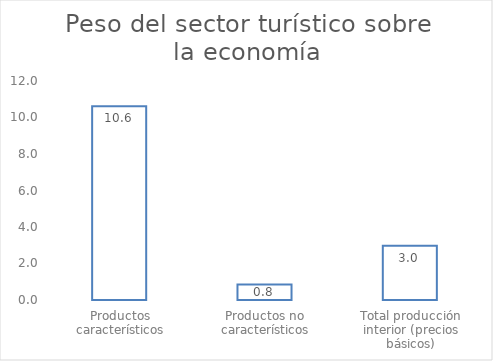
| Category | Series 0 |
|---|---|
| Productos característicos | 10.62 |
| Productos no característicos | 0.848 |
| Total producción interior (precios básicos) | 2.971 |